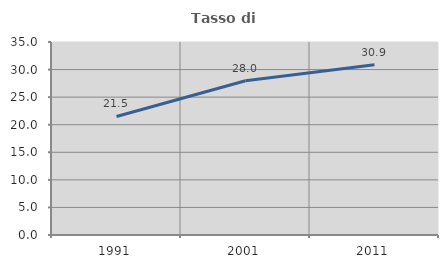
| Category | Tasso di occupazione   |
|---|---|
| 1991.0 | 21.494 |
| 2001.0 | 27.978 |
| 2011.0 | 30.882 |